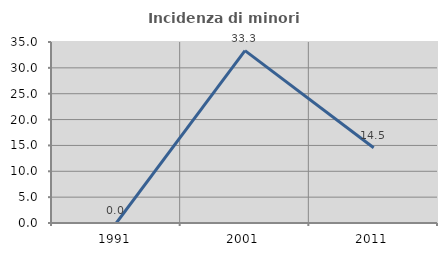
| Category | Incidenza di minori stranieri |
|---|---|
| 1991.0 | 0 |
| 2001.0 | 33.333 |
| 2011.0 | 14.545 |